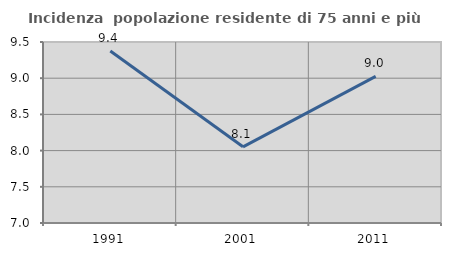
| Category | Incidenza  popolazione residente di 75 anni e più |
|---|---|
| 1991.0 | 9.375 |
| 2001.0 | 8.052 |
| 2011.0 | 9.026 |